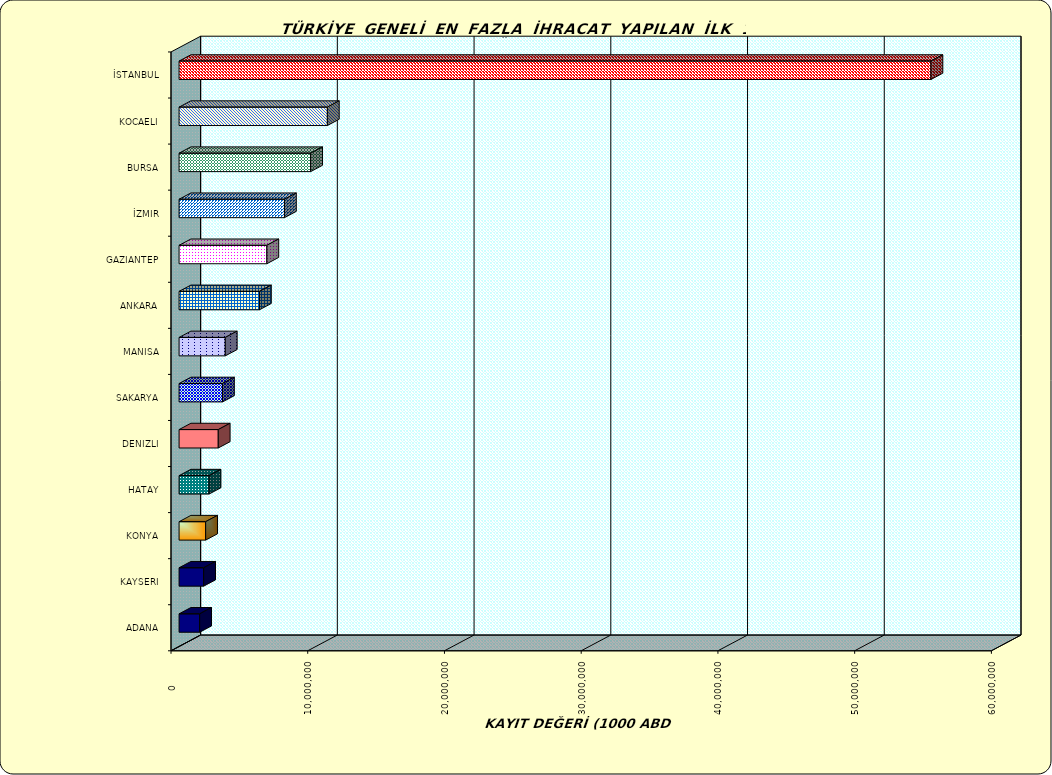
| Category | Series 0 |
|---|---|
| İSTANBUL | 54989343.65 |
| KOCAELI | 10845038.877 |
| BURSA | 9622446.693 |
| İZMIR | 7707800.036 |
| GAZIANTEP | 6418855.056 |
| ANKARA | 5877326.832 |
| MANISA | 3379316.394 |
| SAKARYA | 3175786.085 |
| DENIZLI | 2865411.185 |
| HATAY | 2192379.007 |
| KONYA | 1943180.863 |
| KAYSERI | 1798621.942 |
| ADANA | 1505761.615 |